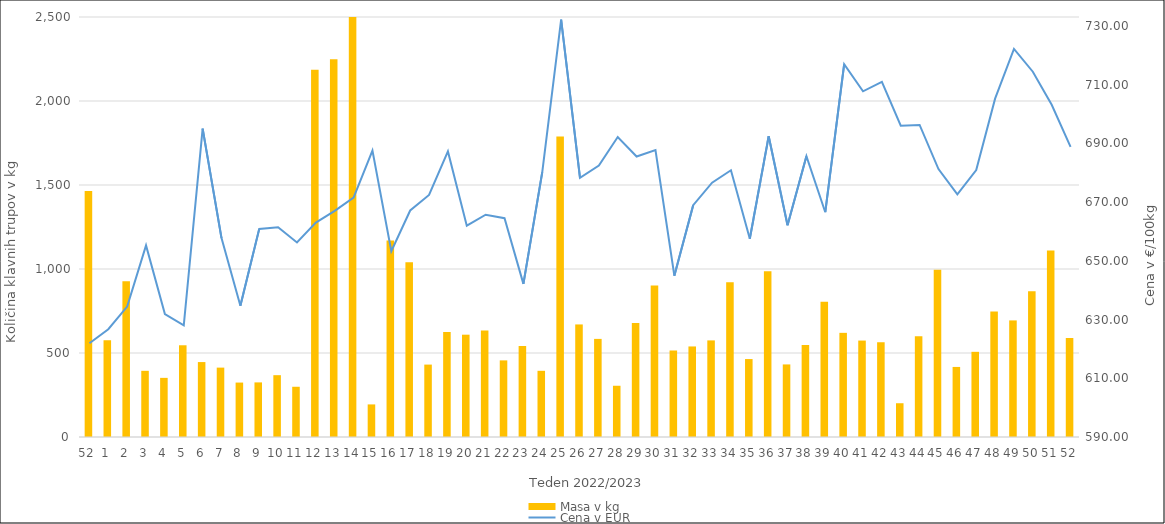
| Category | Masa v kg |
|---|---|
| 52.0 | 1464 |
| 1.0 | 576 |
| 2.0 | 927 |
| 3.0 | 394 |
| 4.0 | 352 |
| 5.0 | 546 |
| 6.0 | 446 |
| 7.0 | 413 |
| 8.0 | 324 |
| 9.0 | 325 |
| 10.0 | 368 |
| 11.0 | 299 |
| 12.0 | 2186 |
| 13.0 | 2249 |
| 14.0 | 4022 |
| 15.0 | 194 |
| 16.0 | 1170 |
| 17.0 | 1040 |
| 18.0 | 431 |
| 19.0 | 625 |
| 20.0 | 609 |
| 21.0 | 634 |
| 22.0 | 456 |
| 23.0 | 541 |
| 24.0 | 394 |
| 25.0 | 1788 |
| 26.0 | 670 |
| 27.0 | 584 |
| 28.0 | 305 |
| 29.0 | 679 |
| 30.0 | 902 |
| 31.0 | 515 |
| 32.0 | 539 |
| 33.0 | 575 |
| 34.0 | 921 |
| 35.0 | 464 |
| 36.0 | 986 |
| 37.0 | 432 |
| 38.0 | 547 |
| 39.0 | 805 |
| 40.0 | 620 |
| 41.0 | 574 |
| 42.0 | 564 |
| 43.0 | 201 |
| 44.0 | 599 |
| 45.0 | 996 |
| 46.0 | 417 |
| 47.0 | 507 |
| 48.0 | 747 |
| 49.0 | 694 |
| 50.0 | 867 |
| 51.0 | 1110 |
| 52.0 | 589 |